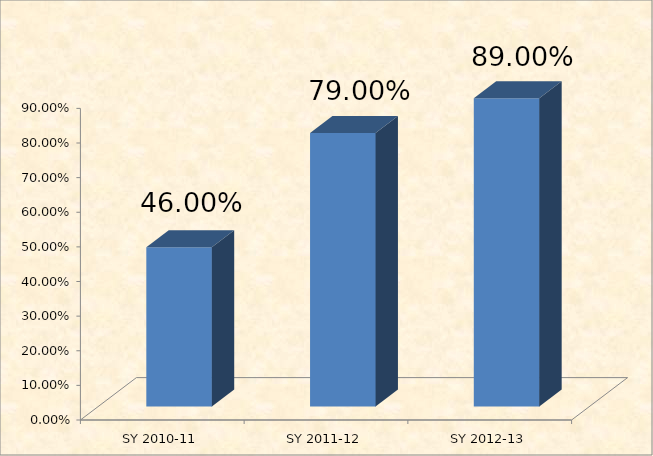
| Category | Series 0 |
|---|---|
| SY 2010-11 | 0.46 |
| SY 2011-12 | 0.79 |
| SY 2012-13 | 0.89 |